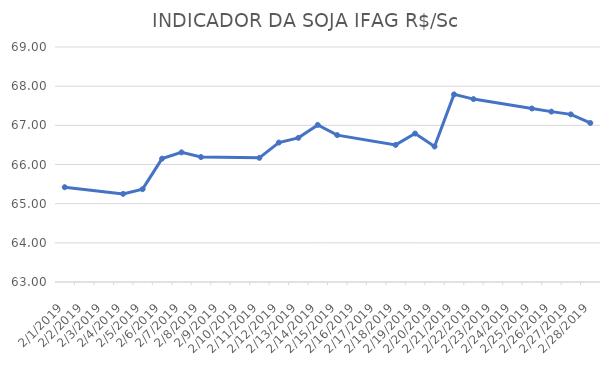
| Category | INDICADOR DA SOJA IFAG |
|---|---|
| 2/1/19 | 65.42 |
| 2/4/19 | 65.25 |
| 2/5/19 | 65.37 |
| 2/6/19 | 66.15 |
| 2/7/19 | 66.31 |
| 2/8/19 | 66.19 |
| 2/11/19 | 66.17 |
| 2/12/19 | 66.56 |
| 2/13/19 | 66.68 |
| 2/14/19 | 67.01 |
| 2/15/19 | 66.75 |
| 2/18/19 | 66.5 |
| 2/19/19 | 66.79 |
| 2/20/19 | 66.46 |
| 2/21/19 | 67.79 |
| 2/22/19 | 67.67 |
| 2/25/19 | 67.43 |
| 2/26/19 | 67.35 |
| 2/27/19 | 67.28 |
| 2/28/19 | 67.06 |